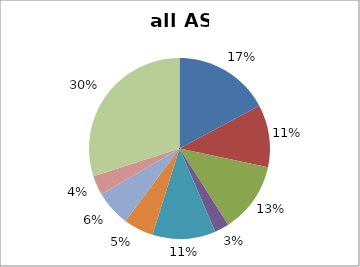
| Category | Series 0 |
|---|---|
| protein metabolism | 2036 |
| misc | 1325 |
| RNA | 1497 |
| DNA | 305 |
| metabolism | 1340 |
| signalling | 636 |
| cell division and development | 752 |
| stress | 413 |
| not assigned | 3555 |